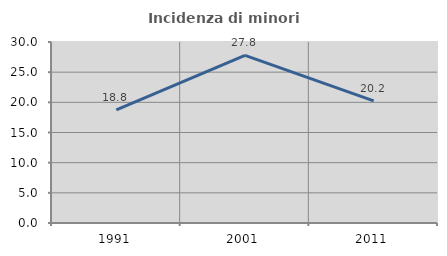
| Category | Incidenza di minori stranieri |
|---|---|
| 1991.0 | 18.75 |
| 2001.0 | 27.778 |
| 2011.0 | 20.245 |